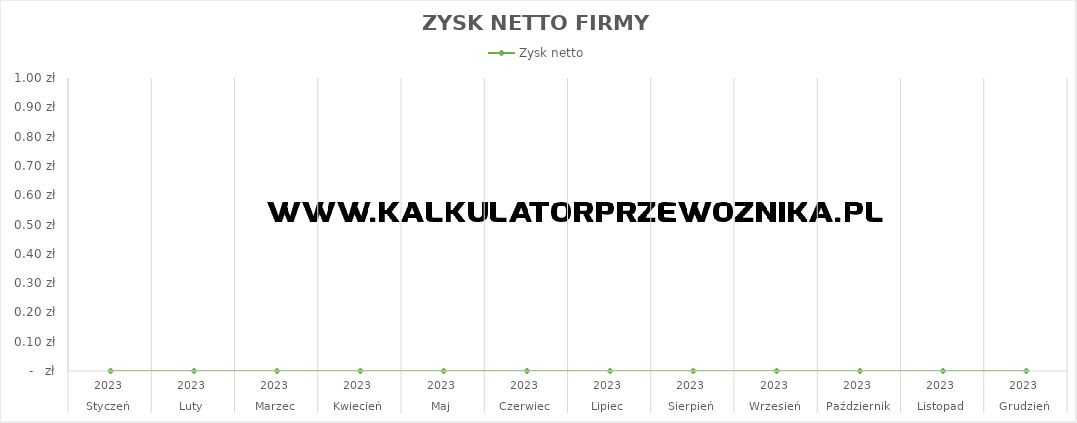
| Category | Zysk netto |
|---|---|
| 0 | 0 |
| 1 | 0 |
| 2 | 0 |
| 3 | 0 |
| 4 | 0 |
| 5 | 0 |
| 6 | 0 |
| 7 | 0 |
| 8 | 0 |
| 9 | 0 |
| 10 | 0 |
| 11 | 0 |